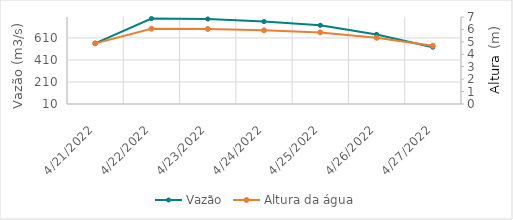
| Category | Vazão |
|---|---|
| 4/24/22 | 764.46 |
| 4/23/22 | 781.98 |
| 4/22/22 | 785.46 |
| 4/21/22 | 560.3 |
| 4/20/22 | 503.89 |
| 4/19/22 | 488.92 |
| 4/18/22 | 495.71 |